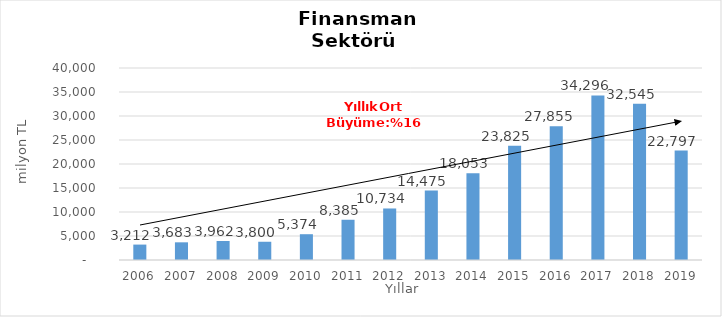
| Category | Finansman |
|---|---|
| 2006.0 | 3212.153 |
| 2007.0 | 3682.969 |
| 2008.0 | 3962.227 |
| 2009.0 | 3800.05 |
| 2010.0 | 5373.931 |
| 2011.0 | 8385.227 |
| 2012.0 | 10734.23 |
| 2013.0 | 14474.899 |
| 2014.0 | 18053.437 |
| 2015.0 | 23825 |
| 2016.0 | 27855 |
| 2017.0 | 34296 |
| 2018.0 | 32545 |
| 2019.0 | 22797 |